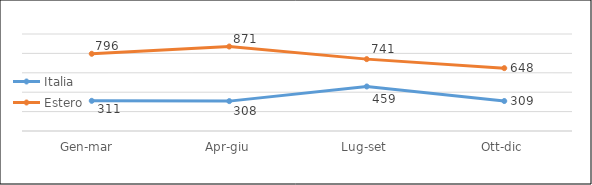
| Category | Italia | Estero |
|---|---|---|
| Gen-mar  | 311 | 796 |
| Apr-giu | 308 | 871 |
| Lug-set | 459 | 741 |
| Ott-dic | 309 | 648 |